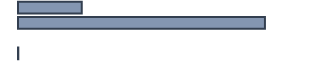
| Category | Series 0 |
|---|---|
| 0 | 20.5 |
| 1 | 79.4 |
| 2 | 0 |
| 3 | 0.1 |